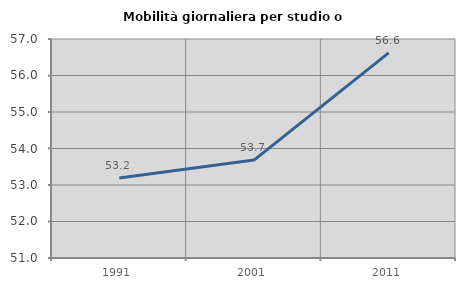
| Category | Mobilità giornaliera per studio o lavoro |
|---|---|
| 1991.0 | 53.19 |
| 2001.0 | 53.682 |
| 2011.0 | 56.621 |